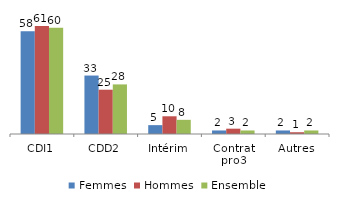
| Category | Femmes | Hommes | Ensemble |
|---|---|---|---|
| CDI1 | 58 | 61 | 60 |
| CDD2 | 33 | 25 | 28 |
| Intérim | 5 | 10 | 8 |
| Contrat pro3 | 2 | 3 | 2 |
| Autres | 2 | 1 | 2 |